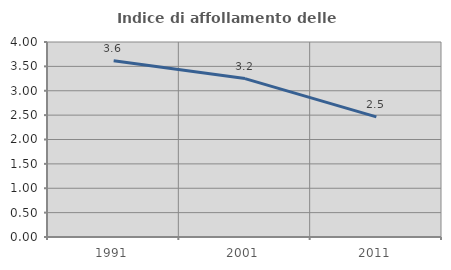
| Category | Indice di affollamento delle abitazioni  |
|---|---|
| 1991.0 | 3.614 |
| 2001.0 | 3.25 |
| 2011.0 | 2.465 |